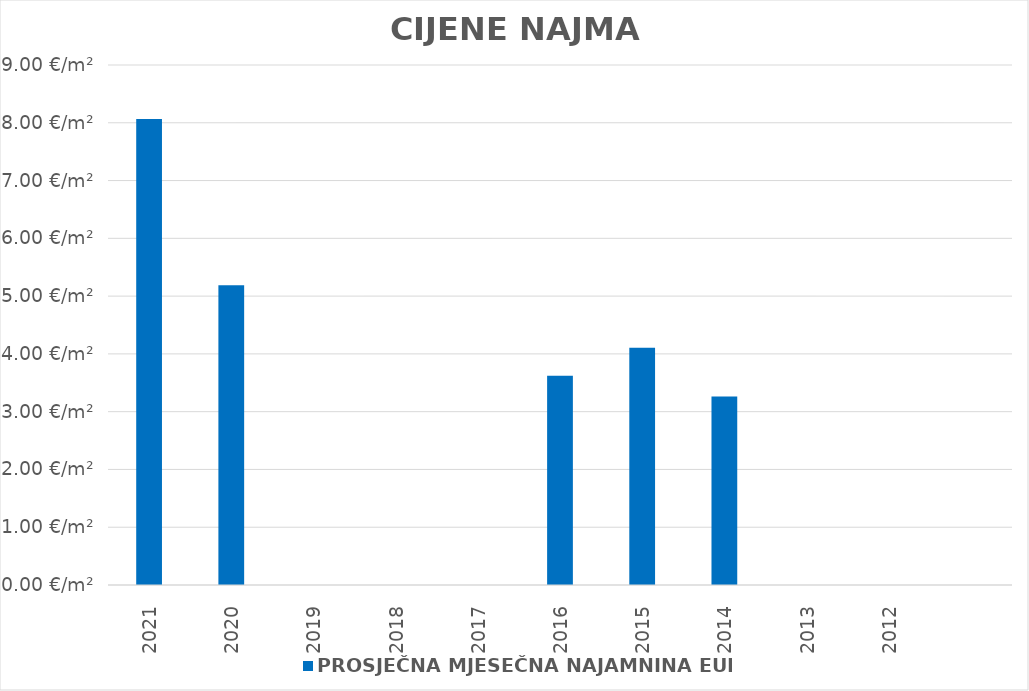
| Category | PROSJEČNA MJESEČNA NAJAMNINA EUR/m² |
|---|---|
| 2021 | 1900-01-08 01:35:31 |
| 2020 | 1900-01-05 04:32:12 |
| 2019 | 0 |
| 2018 | 0 |
| 2017 | 0 |
| 2016 | 1900-01-03 14:53:29 |
| 2015 | 1900-01-04 02:30:00 |
| 2014 | 1900-01-03 06:15:35 |
| 2013 | 0 |
| 2012 | 0 |